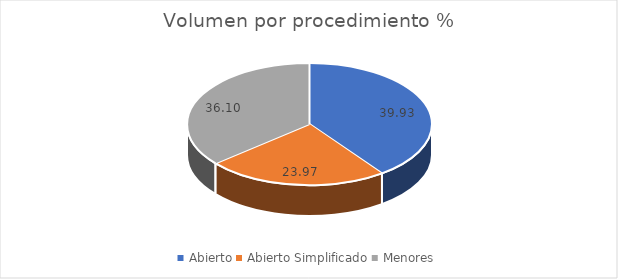
| Category | Series 0 |
|---|---|
| Abierto | 39.93 |
| Abierto Simplificado | 23.967 |
| Menores | 36.103 |